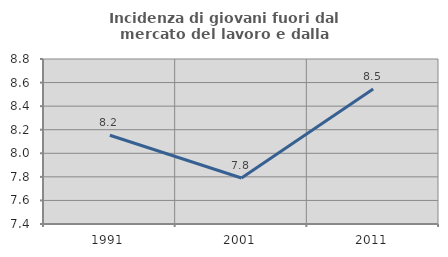
| Category | Incidenza di giovani fuori dal mercato del lavoro e dalla formazione  |
|---|---|
| 1991.0 | 8.153 |
| 2001.0 | 7.79 |
| 2011.0 | 8.546 |